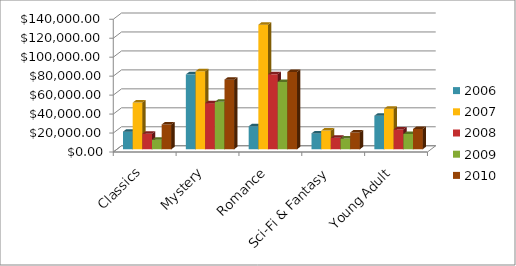
| Category | 2006 | 2007 | 2008 | 2009 | 2010 |
|---|---|---|---|---|---|
| Classics | 18580 | 49225 | 16326 | 10017 | 26134 |
| Mystery | 78970 | 82262 | 48640 | 49985 | 73428 |
| Romance | 24236 | 131390 | 79022 | 71009 | 81474 |
| Sci-Fi & Fantasy | 16730 | 19730 | 12109 | 11355 | 17686 |
| Young Adult | 35358 | 42685 | 20893 | 16065 | 21388 |